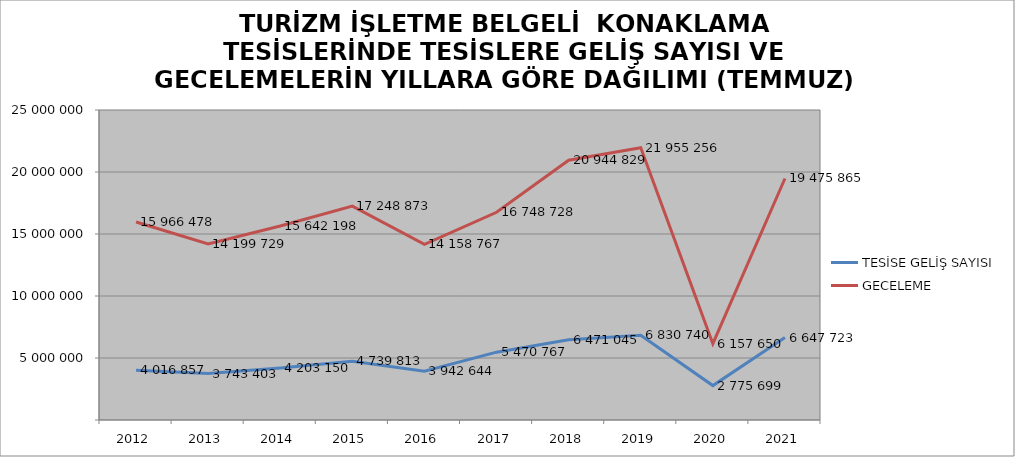
| Category | TESİSE GELİŞ SAYISI | GECELEME |
|---|---|---|
| 2012 | 4016857 | 15966478 |
| 2013 | 3743403 | 14199729 |
| 2014 | 4203150 | 15642198 |
| 2015 | 4739813 | 17248873 |
| 2016 | 3942644 | 14158767 |
| 2017 | 5470767 | 16748728 |
| 2018 | 6471045 | 20944829 |
| 2019 | 6830740 | 21955256 |
| 2020 | 2775699 | 6157650 |
| 2021 | 6647723 | 19475865 |